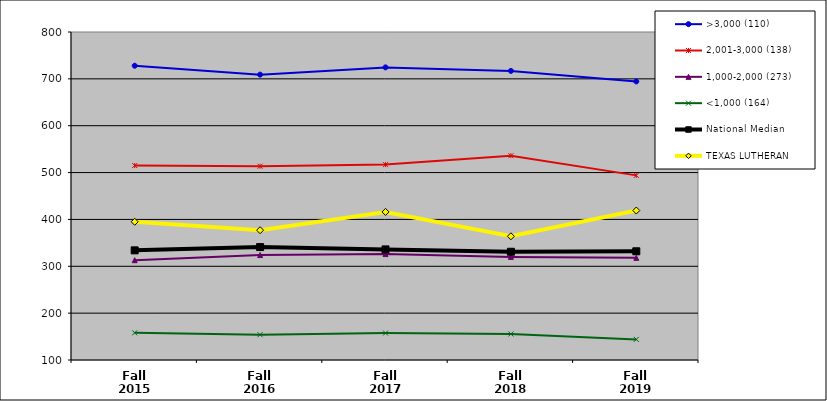
| Category | >3,000 (110) | 2,001-3,000 (138) | 1,000-2,000 (273) | <1,000 (164) | National Median | TEXAS LUTHERAN |
|---|---|---|---|---|---|---|
| Fall 2015 | 728 | 515 | 313 | 158 | 334 | 395 |
| Fall 2016 | 709 | 513.5 | 324 | 154 | 341 | 377 |
| Fall 2017 | 724.5 | 517 | 326 | 157.5 | 336 | 416 |
| Fall 2018 | 717 | 536 | 320 | 155.5 | 331 | 364 |
| Fall 2019 | 694.5 | 494 | 318 | 144 | 332 | 419 |